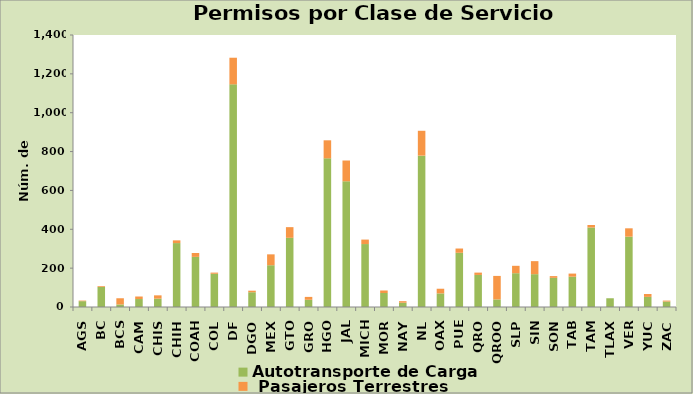
| Category | Autotransporte de Carga  |  Pasajeros Terrestres |
|---|---|---|
| AGS | 30 | 3 |
| BC | 103 | 4 |
| BCS | 13 | 32 |
| CAM | 41 | 13 |
| CHIS | 43 | 17 |
| CHIH | 329 | 14 |
| COAH | 258 | 20 |
| COL | 171 | 6 |
| DF | 1146 | 137 |
| DGO | 76 | 8 |
| MEX | 215 | 56 |
| GTO | 356 | 55 |
| GRO | 37 | 15 |
| HGO | 765 | 93 |
| JAL | 647 | 107 |
| MICH | 324 | 23 |
| MOR | 72 | 13 |
| NAY | 22 | 8 |
| NL | 779 | 128 |
| OAX | 70 | 24 |
| PUE | 279 | 22 |
| QRO | 165 | 12 |
| QROO | 39 | 121 |
| SLP | 174 | 38 |
| SIN | 169 | 67 |
| SON | 150 | 9 |
| TAB | 156 | 16 |
| TAM | 409 | 13 |
| TLAX | 45 | 0 |
| VER | 362 | 43 |
| YUC | 52 | 15 |
| ZAC | 28 | 5 |